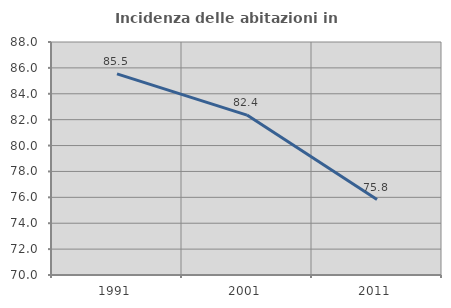
| Category | Incidenza delle abitazioni in proprietà  |
|---|---|
| 1991.0 | 85.535 |
| 2001.0 | 82.353 |
| 2011.0 | 75.824 |